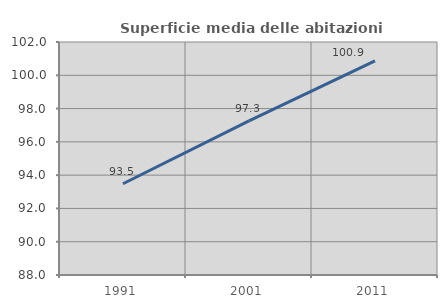
| Category | Superficie media delle abitazioni occupate |
|---|---|
| 1991.0 | 93.483 |
| 2001.0 | 97.259 |
| 2011.0 | 100.87 |